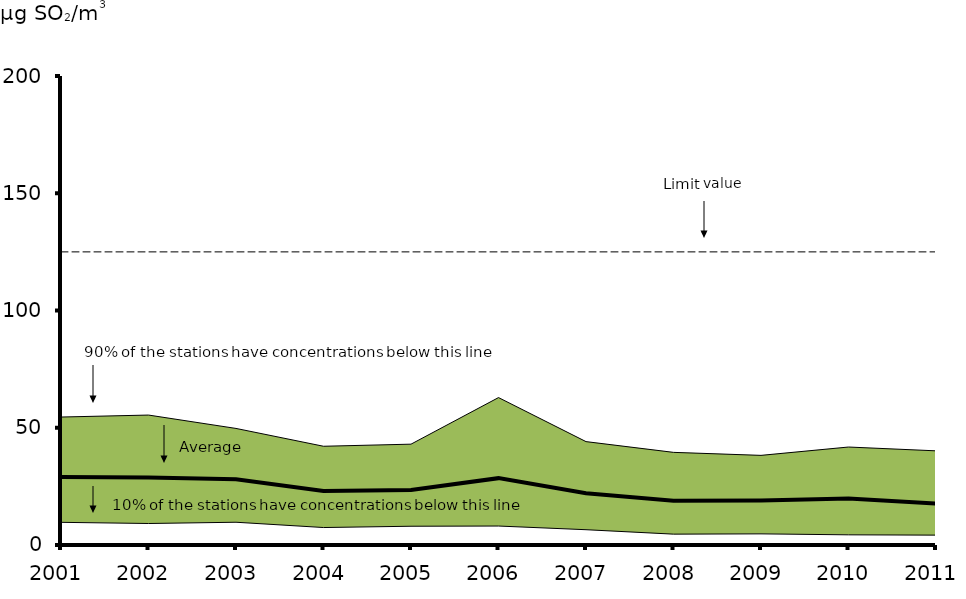
| Category | Average | Limit value |
|---|---|---|
| 2001.0 | 29.022 | 125 |
| 2002.0 | 28.75 | 125 |
| 2003.0 | 28.08 | 125 |
| 2004.0 | 23.063 | 125 |
| 2005.0 | 23.482 | 125 |
| 2006.0 | 28.508 | 125 |
| 2007.0 | 22.081 | 125 |
| 2008.0 | 18.889 | 125 |
| 2009.0 | 18.952 | 125 |
| 2010.0 | 19.782 | 125 |
| 2011.0 | 17.702 | 125 |